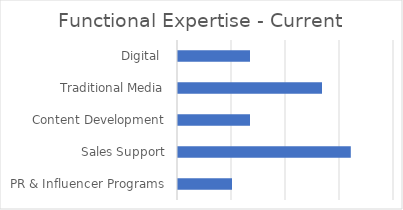
| Category | Current |
|---|---|
| PR & Influencer Programs | 0.5 |
| Sales Support | 1.6 |
| Content Development | 0.667 |
| Traditional Media | 1.333 |
| Digital  | 0.667 |